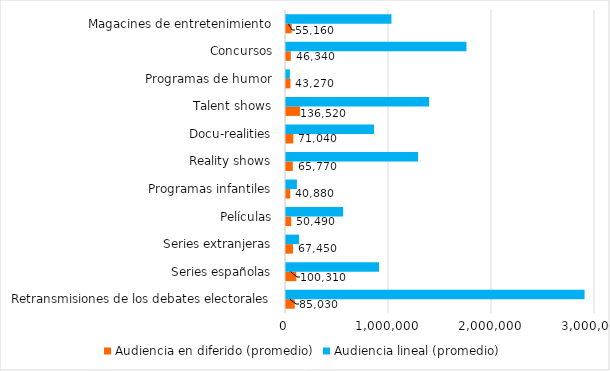
| Category | Audiencia en diferido (promedio) | Audiencia lineal (promedio) |
|---|---|---|
| Retransmisiones de los debates electorales | 85030 | 2898880 |
| Series españolas | 100310 | 903050 |
| Series extranjeras | 67450 | 127130 |
| Películas | 50490 | 555150 |
| Programas infantiles | 40880 | 105900 |
| Reality shows | 65770 | 1283170 |
| Docu-realities | 71040 | 855080 |
| Talent shows | 136520 | 1389720 |
| Programas de humor | 43270 | 37400 |
| Concursos | 46340 | 1752340 |
| Magacines de entretenimiento | 55160 | 1023800 |